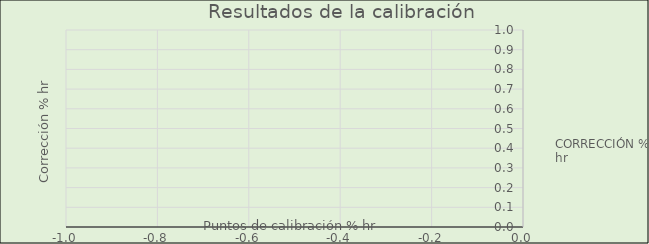
| Category | CORRECCIÓN % hr |
|---|---|
| 0.0 | 0 |
| 0.0 | 0 |
| 0.0 | 0 |